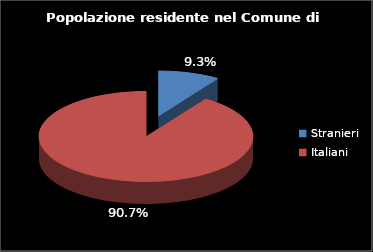
| Category | Series 0 |
|---|---|
| Stranieri | 1929 |
| Italiani | 18775 |